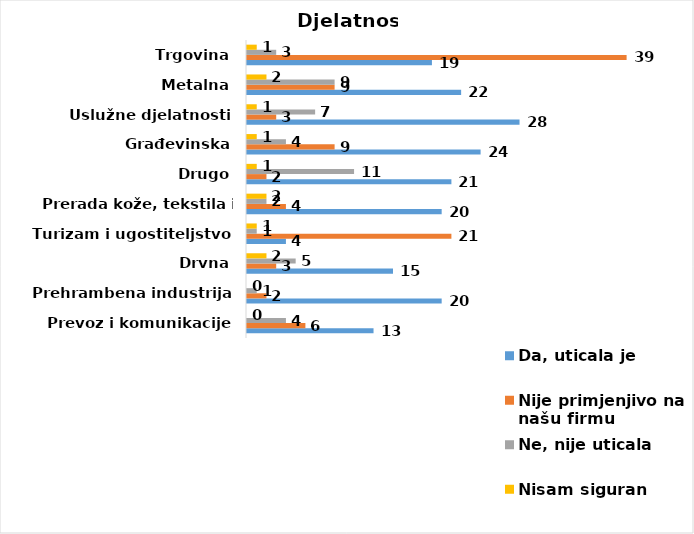
| Category | Da, uticala je | Nije primjenjivo na našu firmu | Ne, nije uticala | Nisam siguran |
|---|---|---|---|---|
| Prevoz i komunikacije | 13 | 6 | 4 | 0 |
| Prehrambena industrija | 20 | 2 | 1 | 0 |
| Drvna | 15 | 3 | 5 | 2 |
| Turizam i ugostiteljstvo | 4 | 21 | 1 | 1 |
| Prerada kože, tekstila i obuće | 20 | 4 | 2 | 2 |
| Drugo | 21 | 2 | 11 | 1 |
| Građevinska | 24 | 9 | 4 | 1 |
| Uslužne djelatnosti | 28 | 3 | 7 | 1 |
| Metalna | 22 | 9 | 9 | 2 |
| Trgovina | 19 | 39 | 3 | 1 |